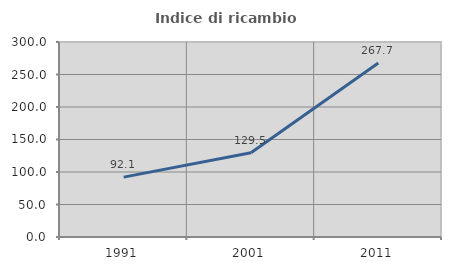
| Category | Indice di ricambio occupazionale  |
|---|---|
| 1991.0 | 92.137 |
| 2001.0 | 129.483 |
| 2011.0 | 267.657 |